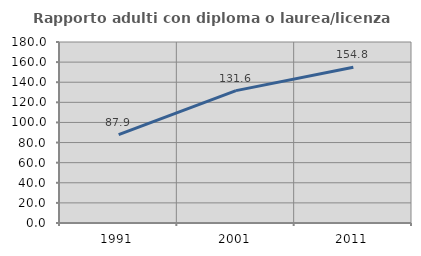
| Category | Rapporto adulti con diploma o laurea/licenza media  |
|---|---|
| 1991.0 | 87.943 |
| 2001.0 | 131.638 |
| 2011.0 | 154.808 |